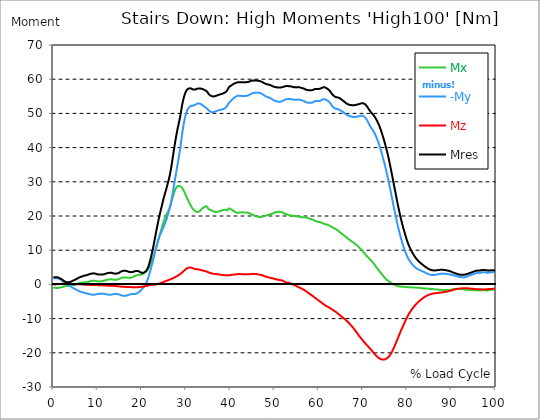
| Category |  Mx |  -My |  Mz |  Mres |
|---|---|---|---|---|
| 0.0 | -0.996 | 1.804 | -0.054 | 2.087 |
| 0.167348456675344 | -0.942 | 1.791 | -0.027 | 2.06 |
| 0.334696913350688 | -0.969 | 1.791 | -0.013 | 2.073 |
| 0.5020453700260321 | -1.037 | 1.804 | 0 | 2.114 |
| 0.669393826701376 | -1.064 | 1.791 | 0.027 | 2.114 |
| 0.83674228337672 | -1.064 | 1.777 | 0.054 | 2.087 |
| 1.0040907400520642 | -1.023 | 1.75 | 0.081 | 2.06 |
| 1.1621420602454444 | -0.983 | 1.683 | 0.108 | 1.979 |
| 1.3294905169207885 | -0.942 | 1.602 | 0.135 | 1.885 |
| 1.4968389735961325 | -0.916 | 1.508 | 0.162 | 1.791 |
| 1.6641874302714765 | -0.875 | 1.387 | 0.175 | 1.669 |
| 1.8315358869468206 | -0.835 | 1.266 | 0.188 | 1.535 |
| 1.9988843436221646 | -0.781 | 1.117 | 0.202 | 1.4 |
| 2.1662328002975086 | -0.714 | 0.956 | 0.202 | 1.239 |
| 2.333581256972853 | -0.633 | 0.754 | 0.188 | 1.05 |
| 2.5009297136481967 | -0.552 | 0.539 | 0.175 | 0.889 |
| 2.6682781703235405 | -0.525 | 0.35 | 0.175 | 0.794 |
| 2.8356266269988843 | -0.498 | 0.242 | 0.162 | 0.714 |
| 3.002975083674229 | -0.485 | 0.135 | 0.162 | 0.646 |
| 3.1703235403495724 | -0.471 | -0.013 | 0.148 | 0.619 |
| 3.337671997024917 | -0.471 | -0.162 | 0.148 | 0.619 |
| 3.4957233172182973 | -0.458 | -0.296 | 0.135 | 0.633 |
| 3.663071773893641 | -0.404 | -0.431 | 0.135 | 0.673 |
| 3.8304202305689854 | -0.364 | -0.565 | 0.121 | 0.74 |
| 3.997768687244329 | -0.337 | -0.687 | 0.108 | 0.808 |
| 4.165117143919673 | -0.296 | -0.821 | 0.108 | 0.902 |
| 4.332465600595017 | -0.256 | -0.956 | 0.094 | 1.023 |
| 4.499814057270361 | -0.215 | -1.091 | 0.067 | 1.131 |
| 4.667162513945706 | -0.188 | -1.198 | 0.054 | 1.239 |
| 4.834510970621049 | -0.135 | -1.306 | 0.04 | 1.333 |
| 5.001859427296393 | -0.04 | -1.4 | 0.04 | 1.427 |
| 5.169207883971737 | 0.054 | -1.521 | 0.04 | 1.548 |
| 5.336556340647081 | 0.135 | -1.656 | 0.027 | 1.669 |
| 5.503904797322425 | 0.215 | -1.764 | 0.027 | 1.791 |
| 5.671253253997769 | 0.283 | -1.871 | 0.027 | 1.912 |
| 5.82930457419115 | 0.35 | -1.966 | 0.013 | 2.006 |
| 5.996653030866494 | 0.417 | -2.06 | 0.013 | 2.114 |
| 6.164001487541838 | 0.458 | -2.127 | 0.013 | 2.195 |
| 6.331349944217181 | 0.471 | -2.208 | 0 | 2.262 |
| 6.498698400892526 | 0.498 | -2.275 | -0.013 | 2.343 |
| 6.66604685756787 | 0.539 | -2.343 | -0.04 | 2.41 |
| 6.833395314243213 | 0.579 | -2.41 | -0.054 | 2.477 |
| 7.000743770918558 | 0.646 | -2.464 | -0.067 | 2.558 |
| 7.168092227593902 | 0.646 | -2.518 | -0.067 | 2.598 |
| 7.335440684269246 | 0.606 | -2.558 | -0.081 | 2.639 |
| 7.50278914094459 | 0.592 | -2.612 | -0.081 | 2.679 |
| 7.6701375976199335 | 0.633 | -2.666 | -0.108 | 2.747 |
| 7.837486054295278 | 0.714 | -2.72 | -0.121 | 2.827 |
| 7.995537374488658 | 0.794 | -2.787 | -0.135 | 2.908 |
| 8.162885831164003 | 0.875 | -2.841 | -0.148 | 2.989 |
| 8.330234287839346 | 0.942 | -2.895 | -0.175 | 3.056 |
| 8.49758274451469 | 0.996 | -2.948 | -0.175 | 3.123 |
| 8.664931201190035 | 1.05 | -2.989 | -0.175 | 3.177 |
| 8.832279657865378 | 1.091 | -3.016 | -0.188 | 3.218 |
| 8.999628114540721 | 1.104 | -3.029 | -0.188 | 3.231 |
| 9.166976571216066 | 1.117 | -3.029 | -0.188 | 3.245 |
| 9.334325027891412 | 1.091 | -3.002 | -0.188 | 3.204 |
| 9.501673484566755 | 1.037 | -2.962 | -0.188 | 3.15 |
| 9.669021941242098 | 0.969 | -2.895 | -0.202 | 3.07 |
| 9.836370397917442 | 0.916 | -2.827 | -0.202 | 2.989 |
| 10.003718854592787 | 0.889 | -2.787 | -0.215 | 2.935 |
| 10.17106731126813 | 0.862 | -2.747 | -0.229 | 2.895 |
| 10.329118631461512 | 0.875 | -2.747 | -0.242 | 2.895 |
| 10.496467088136853 | 0.942 | -2.747 | -0.242 | 2.922 |
| 10.663815544812199 | 0.942 | -2.733 | -0.256 | 2.908 |
| 10.831164001487544 | 0.916 | -2.706 | -0.256 | 2.868 |
| 10.998512458162887 | 0.916 | -2.706 | -0.269 | 2.868 |
| 11.16586091483823 | 0.956 | -2.706 | -0.296 | 2.895 |
| 11.333209371513574 | 1.023 | -2.733 | -0.31 | 2.935 |
| 11.50055782818892 | 1.091 | -2.76 | -0.323 | 2.989 |
| 11.667906284864264 | 1.171 | -2.8 | -0.337 | 3.056 |
| 11.835254741539607 | 1.239 | -2.854 | -0.337 | 3.137 |
| 12.00260319821495 | 1.306 | -2.908 | -0.35 | 3.204 |
| 12.169951654890292 | 1.36 | -2.948 | -0.35 | 3.272 |
| 12.337300111565641 | 1.4 | -2.989 | -0.364 | 3.325 |
| 12.504648568240984 | 1.441 | -3.016 | -0.364 | 3.366 |
| 12.662699888434362 | 1.468 | -3.016 | -0.377 | 3.379 |
| 12.830048345109708 | 1.494 | -3.029 | -0.377 | 3.406 |
| 12.997396801785053 | 1.508 | -3.016 | -0.377 | 3.406 |
| 13.164745258460396 | 1.494 | -2.989 | -0.39 | 3.366 |
| 13.33209371513574 | 1.454 | -2.948 | -0.404 | 3.325 |
| 13.499442171811083 | 1.414 | -2.895 | -0.417 | 3.258 |
| 13.666790628486426 | 1.387 | -2.827 | -0.431 | 3.191 |
| 13.834139085161771 | 1.373 | -2.787 | -0.444 | 3.15 |
| 14.001487541837117 | 1.373 | -2.773 | -0.471 | 3.137 |
| 14.16883599851246 | 1.373 | -2.773 | -0.485 | 3.137 |
| 14.336184455187803 | 1.387 | -2.787 | -0.512 | 3.164 |
| 14.503532911863147 | 1.427 | -2.814 | -0.539 | 3.218 |
| 14.670881368538492 | 1.494 | -2.854 | -0.552 | 3.285 |
| 14.828932688731873 | 1.575 | -2.922 | -0.579 | 3.393 |
| 14.996281145407215 | 1.683 | -3.016 | -0.619 | 3.527 |
| 15.163629602082558 | 1.777 | -3.11 | -0.646 | 3.662 |
| 15.330978058757903 | 1.858 | -3.191 | -0.66 | 3.77 |
| 15.498326515433247 | 1.925 | -3.258 | -0.673 | 3.864 |
| 15.665674972108594 | 1.979 | -3.299 | -0.687 | 3.931 |
| 15.833023428783937 | 2.033 | -3.325 | -0.7 | 3.972 |
| 16.00037188545928 | 2.046 | -3.339 | -0.714 | 3.999 |
| 16.167720342134626 | 2.046 | -3.325 | -0.727 | 3.985 |
| 16.335068798809967 | 2.046 | -3.312 | -0.727 | 3.972 |
| 16.502417255485312 | 2.019 | -3.285 | -0.74 | 3.931 |
| 16.669765712160658 | 1.979 | -3.231 | -0.754 | 3.877 |
| 16.837114168836 | 1.939 | -3.15 | -0.754 | 3.797 |
| 17.004462625511344 | 1.912 | -3.056 | -0.767 | 3.702 |
| 17.16251394570472 | 1.898 | -2.989 | -0.781 | 3.649 |
| 17.32986240238007 | 1.912 | -2.922 | -0.781 | 3.608 |
| 17.497210859055414 | 1.939 | -2.868 | -0.794 | 3.581 |
| 17.664559315730756 | 1.979 | -2.827 | -0.808 | 3.568 |
| 17.8319077724061 | 2.06 | -2.814 | -0.808 | 3.608 |
| 17.999256229081443 | 2.141 | -2.8 | -0.821 | 3.635 |
| 18.166604685756788 | 2.248 | -2.814 | -0.821 | 3.716 |
| 18.333953142432133 | 2.383 | -2.814 | -0.835 | 3.81 |
| 18.501301599107478 | 2.491 | -2.814 | -0.835 | 3.891 |
| 18.668650055782823 | 2.585 | -2.76 | -0.835 | 3.931 |
| 18.835998512458165 | 2.679 | -2.666 | -0.821 | 3.931 |
| 19.00334696913351 | 2.747 | -2.518 | -0.808 | 3.931 |
| 19.170695425808855 | 2.8 | -2.41 | -0.794 | 3.904 |
| 19.338043882484197 | 2.8 | -2.275 | -0.781 | 3.824 |
| 19.496095202677576 | 2.8 | -2.114 | -0.781 | 3.716 |
| 19.66344365935292 | 2.8 | -1.898 | -0.767 | 3.568 |
| 19.830792116028263 | 2.8 | -1.656 | -0.74 | 3.433 |
| 19.998140572703612 | 2.895 | -1.387 | -0.687 | 3.366 |
| 20.165489029378953 | 2.989 | -1.185 | -0.673 | 3.366 |
| 20.3328374860543 | 3.123 | -0.969 | -0.646 | 3.393 |
| 20.500185942729644 | 3.285 | -0.7 | -0.606 | 3.46 |
| 20.667534399404985 | 3.46 | -0.323 | -0.552 | 3.581 |
| 20.83488285608033 | 3.635 | 0 | -0.512 | 3.743 |
| 21.002231312755672 | 3.851 | 0.404 | -0.471 | 3.985 |
| 21.16957976943102 | 4.079 | 0.902 | -0.417 | 4.322 |
| 21.336928226106362 | 4.362 | 1.481 | -0.364 | 4.753 |
| 21.504276682781704 | 4.685 | 2.114 | -0.31 | 5.264 |
| 21.67162513945705 | 5.089 | 2.868 | -0.269 | 5.978 |
| 21.82967645965043 | 5.56 | 3.608 | -0.229 | 6.745 |
| 21.997024916325774 | 6.058 | 4.376 | -0.188 | 7.58 |
| 22.16437337300112 | 6.57 | 5.17 | -0.162 | 8.468 |
| 22.33172182967646 | 7.109 | 5.978 | -0.135 | 9.397 |
| 22.499070286351806 | 7.701 | 6.826 | -0.108 | 10.407 |
| 22.666418743027148 | 8.347 | 7.701 | -0.094 | 11.471 |
| 22.833767199702496 | 9.034 | 8.617 | -0.067 | 12.602 |
| 23.00111565637784 | 9.734 | 9.532 | -0.04 | 13.746 |
| 23.168464113053183 | 10.461 | 10.421 | -0.013 | 14.877 |
| 23.335812569728528 | 11.201 | 11.255 | 0.013 | 16.008 |
| 23.50316102640387 | 11.982 | 12.023 | 0.054 | 17.098 |
| 23.670509483079215 | 12.723 | 12.75 | 0.121 | 18.149 |
| 23.83785793975456 | 13.517 | 13.423 | 0.202 | 19.185 |
| 23.995909259947936 | 14.285 | 14.069 | 0.283 | 20.182 |
| 24.163257716623285 | 15.025 | 14.581 | 0.35 | 21.084 |
| 24.330606173298627 | 15.739 | 15.065 | 0.431 | 21.959 |
| 24.49795462997397 | 16.479 | 15.577 | 0.525 | 22.861 |
| 24.665303086649313 | 17.206 | 16.075 | 0.592 | 23.749 |
| 24.83265154332466 | 17.933 | 16.587 | 0.687 | 24.638 |
| 25.0 | 18.579 | 17.112 | 0.754 | 25.473 |
| 25.167348456675345 | 19.199 | 17.61 | 0.848 | 26.253 |
| 25.334696913350694 | 19.697 | 18.162 | 0.929 | 26.994 |
| 25.502045370026035 | 20.195 | 18.754 | 0.996 | 27.748 |
| 25.669393826701377 | 20.666 | 19.428 | 1.077 | 28.556 |
| 25.836742283376722 | 21.11 | 20.155 | 1.171 | 29.363 |
| 26.004090740052067 | 21.541 | 20.922 | 1.252 | 30.198 |
| 26.17143919672741 | 21.945 | 21.716 | 1.333 | 31.046 |
| 26.329490516920792 | 22.497 | 22.524 | 1.414 | 31.989 |
| 26.49683897359613 | 23.143 | 23.399 | 1.508 | 33.079 |
| 26.66418743027148 | 23.938 | 24.436 | 1.589 | 34.358 |
| 26.831535886946828 | 24.746 | 25.553 | 1.683 | 35.705 |
| 26.998884343622166 | 25.553 | 26.859 | 1.777 | 37.172 |
| 27.166232800297514 | 26.294 | 28.098 | 1.871 | 38.572 |
| 27.333581256972852 | 26.927 | 29.39 | 1.979 | 39.946 |
| 27.5009297136482 | 27.519 | 30.683 | 2.087 | 41.292 |
| 27.668278170323543 | 28.004 | 31.962 | 2.208 | 42.571 |
| 27.835626626998888 | 28.34 | 33.214 | 2.329 | 43.756 |
| 28.002975083674233 | 28.636 | 34.466 | 2.464 | 44.9 |
| 28.170323540349575 | 28.811 | 35.705 | 2.612 | 45.977 |
| 28.33767199702492 | 28.811 | 36.957 | 2.733 | 46.974 |
| 28.50502045370026 | 28.785 | 38.222 | 2.854 | 47.97 |
| 28.663071773893645 | 28.717 | 39.596 | 3.002 | 49.047 |
| 28.830420230568986 | 28.583 | 41.184 | 3.164 | 50.272 |
| 28.99776868724433 | 28.394 | 42.881 | 3.352 | 51.565 |
| 29.165117143919673 | 28.152 | 44.483 | 3.554 | 52.79 |
| 29.33246560059502 | 27.775 | 45.856 | 3.756 | 53.772 |
| 29.499814057270367 | 27.357 | 47.122 | 3.958 | 54.648 |
| 29.66716251394571 | 26.913 | 48.226 | 4.133 | 55.402 |
| 29.834510970621054 | 26.402 | 49.181 | 4.349 | 56.007 |
| 30.00185942729639 | 25.917 | 49.922 | 4.51 | 56.452 |
| 30.169207883971744 | 25.405 | 50.595 | 4.645 | 56.829 |
| 30.33655634064708 | 24.948 | 51.093 | 4.779 | 57.084 |
| 30.50390479732243 | 24.49 | 51.47 | 4.86 | 57.233 |
| 30.671253253997772 | 24.059 | 51.74 | 4.914 | 57.313 |
| 30.829304574191156 | 23.628 | 51.968 | 4.955 | 57.34 |
| 30.996653030866494 | 23.224 | 52.13 | 4.955 | 57.327 |
| 31.164001487541842 | 22.82 | 52.238 | 4.914 | 57.273 |
| 31.331349944217187 | 22.43 | 52.265 | 4.833 | 57.138 |
| 31.498698400892525 | 22.12 | 52.251 | 4.726 | 57.017 |
| 31.666046857567874 | 21.837 | 52.292 | 4.658 | 56.95 |
| 31.833395314243212 | 21.662 | 52.386 | 4.591 | 56.963 |
| 32.00074377091856 | 21.528 | 52.467 | 4.524 | 56.99 |
| 32.1680922275939 | 21.326 | 52.588 | 4.47 | 57.017 |
| 32.33544068426925 | 21.232 | 52.736 | 4.456 | 57.125 |
| 32.50278914094459 | 21.191 | 52.844 | 4.429 | 57.206 |
| 32.670137597619934 | 21.178 | 52.911 | 4.403 | 57.259 |
| 32.83748605429528 | 21.245 | 52.911 | 4.362 | 57.286 |
| 33.004834510970625 | 21.312 | 52.924 | 4.322 | 57.313 |
| 33.162885831164004 | 21.501 | 52.844 | 4.254 | 57.286 |
| 33.33023428783935 | 21.77 | 52.736 | 4.201 | 57.273 |
| 33.497582744514695 | 21.999 | 52.601 | 4.133 | 57.219 |
| 33.664931201190036 | 22.214 | 52.44 | 4.079 | 57.152 |
| 33.83227965786538 | 22.376 | 52.292 | 4.026 | 57.058 |
| 33.99962811454073 | 22.443 | 52.143 | 3.999 | 56.95 |
| 34.16697657121607 | 22.591 | 51.982 | 3.931 | 56.856 |
| 34.33432502789141 | 22.74 | 51.807 | 3.877 | 56.761 |
| 34.50167348456676 | 22.888 | 51.632 | 3.81 | 56.654 |
| 34.6690219412421 | 22.888 | 51.443 | 3.756 | 56.479 |
| 34.83637039791744 | 22.578 | 51.322 | 3.675 | 56.25 |
| 35.00371885459279 | 22.134 | 51.093 | 3.554 | 55.886 |
| 35.17106731126814 | 21.945 | 50.837 | 3.46 | 55.59 |
| 35.338415767943474 | 21.811 | 50.622 | 3.379 | 55.348 |
| 35.49646708813686 | 21.77 | 50.501 | 3.312 | 55.227 |
| 35.6638155448122 | 21.689 | 50.42 | 3.258 | 55.119 |
| 35.831164001487544 | 21.568 | 50.38 | 3.218 | 55.038 |
| 35.998512458162885 | 21.474 | 50.326 | 3.164 | 54.957 |
| 36.165860914838234 | 21.42 | 50.339 | 3.11 | 54.944 |
| 36.333209371513576 | 21.326 | 50.407 | 3.07 | 54.971 |
| 36.50055782818892 | 21.191 | 50.501 | 3.056 | 55.025 |
| 36.667906284864266 | 21.084 | 50.609 | 3.043 | 55.078 |
| 36.83525474153961 | 21.097 | 50.689 | 3.029 | 55.159 |
| 37.002603198214956 | 21.164 | 50.757 | 2.989 | 55.253 |
| 37.1699516548903 | 21.218 | 50.824 | 2.962 | 55.321 |
| 37.337300111565646 | 21.312 | 50.878 | 2.935 | 55.402 |
| 37.50464856824098 | 21.353 | 50.959 | 2.895 | 55.482 |
| 37.66269988843437 | 21.407 | 50.999 | 2.854 | 55.536 |
| 37.83004834510971 | 21.474 | 51.053 | 2.827 | 55.59 |
| 37.99739680178505 | 21.555 | 51.107 | 2.787 | 55.657 |
| 38.16474525846039 | 21.636 | 51.161 | 2.747 | 55.738 |
| 38.33209371513574 | 21.73 | 51.214 | 2.72 | 55.819 |
| 38.49944217181109 | 21.824 | 51.295 | 2.706 | 55.913 |
| 38.666790628486424 | 21.837 | 51.416 | 2.693 | 56.021 |
| 38.83413908516178 | 21.824 | 51.551 | 2.679 | 56.129 |
| 39.001487541837115 | 21.837 | 51.74 | 2.679 | 56.304 |
| 39.16883599851246 | 21.784 | 51.995 | 2.666 | 56.506 |
| 39.336184455187805 | 21.649 | 52.278 | 2.625 | 56.707 |
| 39.503532911863154 | 21.837 | 52.709 | 2.612 | 57.165 |
| 39.670881368538495 | 22.201 | 53.072 | 2.652 | 57.636 |
| 39.83822982521384 | 22.241 | 53.288 | 2.693 | 57.838 |
| 39.996281145407224 | 22.134 | 53.476 | 2.733 | 57.973 |
| 40.163629602082565 | 21.959 | 53.692 | 2.76 | 58.108 |
| 40.33097805875791 | 21.784 | 53.921 | 2.787 | 58.256 |
| 40.498326515433256 | 21.676 | 54.163 | 2.8 | 58.431 |
| 40.6656749721086 | 21.568 | 54.351 | 2.841 | 58.579 |
| 40.83302342878393 | 21.407 | 54.526 | 2.881 | 58.687 |
| 41.00037188545929 | 21.286 | 54.661 | 2.922 | 58.767 |
| 41.16772034213463 | 21.164 | 54.809 | 2.922 | 58.862 |
| 41.33506879880997 | 21.057 | 54.957 | 2.935 | 58.956 |
| 41.50241725548531 | 20.962 | 55.078 | 2.962 | 59.037 |
| 41.66976571216066 | 20.922 | 55.146 | 2.989 | 59.09 |
| 41.837114168836 | 21.003 | 55.146 | 3.029 | 59.117 |
| 42.004462625511344 | 20.989 | 55.173 | 3.029 | 59.144 |
| 42.17181108218669 | 20.976 | 55.186 | 3.043 | 59.144 |
| 42.32986240238007 | 21.043 | 55.132 | 3.016 | 59.131 |
| 42.497210859055414 | 21.097 | 55.092 | 2.989 | 59.104 |
| 42.66455931573076 | 21.084 | 55.078 | 2.975 | 59.09 |
| 42.831907772406105 | 21.057 | 55.078 | 2.948 | 59.077 |
| 42.999256229081446 | 21.043 | 55.105 | 2.948 | 59.09 |
| 43.16660468575679 | 21.043 | 55.078 | 2.935 | 59.077 |
| 43.33395314243214 | 21.057 | 55.065 | 2.962 | 59.064 |
| 43.50130159910748 | 21.043 | 55.092 | 2.935 | 59.077 |
| 43.66865005578282 | 21.043 | 55.132 | 2.948 | 59.131 |
| 43.83599851245817 | 21.003 | 55.173 | 2.962 | 59.144 |
| 44.00334696913351 | 20.949 | 55.24 | 2.962 | 59.185 |
| 44.17069542580886 | 20.882 | 55.321 | 2.948 | 59.239 |
| 44.3380438824842 | 20.801 | 55.428 | 2.962 | 59.319 |
| 44.49609520267758 | 20.707 | 55.577 | 3.016 | 59.414 |
| 44.66344365935292 | 20.572 | 55.698 | 3.043 | 59.494 |
| 44.83079211602827 | 20.478 | 55.805 | 3.029 | 59.548 |
| 44.99814057270361 | 20.37 | 55.886 | 3.043 | 59.602 |
| 45.16548902937895 | 20.262 | 55.954 | 3.07 | 59.629 |
| 45.332837486054295 | 20.155 | 56.007 | 3.083 | 59.642 |
| 45.500185942729644 | 20.074 | 56.034 | 3.07 | 59.629 |
| 45.66753439940499 | 19.993 | 56.048 | 3.056 | 59.616 |
| 45.83488285608033 | 19.926 | 56.061 | 3.056 | 59.602 |
| 46.00223131275568 | 19.845 | 56.075 | 3.002 | 59.589 |
| 46.16957976943102 | 19.791 | 56.075 | 2.962 | 59.575 |
| 46.336928226106366 | 19.751 | 56.075 | 2.908 | 59.562 |
| 46.50427668278171 | 19.737 | 56.034 | 2.881 | 59.508 |
| 46.671625139457056 | 19.71 | 55.98 | 2.841 | 59.454 |
| 46.829676459650436 | 19.71 | 55.913 | 2.8 | 59.387 |
| 46.99702491632577 | 19.737 | 55.819 | 2.76 | 59.306 |
| 47.16437337300112 | 19.791 | 55.698 | 2.693 | 59.212 |
| 47.33172182967646 | 19.858 | 55.563 | 2.625 | 59.104 |
| 47.49907028635181 | 19.899 | 55.415 | 2.545 | 58.969 |
| 47.66641874302716 | 19.953 | 55.253 | 2.437 | 58.835 |
| 47.83376719970249 | 20.033 | 55.119 | 2.37 | 58.727 |
| 48.001115656377834 | 20.114 | 55.011 | 2.289 | 58.66 |
| 48.16846411305319 | 20.195 | 54.917 | 2.221 | 58.592 |
| 48.33581256972853 | 20.262 | 54.809 | 2.154 | 58.512 |
| 48.50316102640387 | 20.316 | 54.742 | 2.1 | 58.458 |
| 48.67050948307921 | 20.37 | 54.675 | 2.046 | 58.417 |
| 48.837857939754564 | 20.451 | 54.607 | 2.006 | 58.377 |
| 49.005206396429905 | 20.518 | 54.5 | 1.952 | 58.31 |
| 49.163257716623285 | 20.545 | 54.392 | 1.898 | 58.215 |
| 49.33060617329863 | 20.612 | 54.244 | 1.844 | 58.094 |
| 49.49795462997397 | 20.693 | 54.096 | 1.791 | 57.987 |
| 49.66530308664932 | 20.774 | 53.948 | 1.75 | 57.879 |
| 49.832651543324666 | 20.868 | 53.84 | 1.683 | 57.825 |
| 50.0 | 20.989 | 53.746 | 1.616 | 57.758 |
| 50.16734845667534 | 21.097 | 53.638 | 1.562 | 57.704 |
| 50.33469691335069 | 21.124 | 53.584 | 1.508 | 57.663 |
| 50.50204537002604 | 21.151 | 53.517 | 1.454 | 57.623 |
| 50.66939382670139 | 21.178 | 53.476 | 1.414 | 57.596 |
| 50.836742283376715 | 21.218 | 53.436 | 1.36 | 57.569 |
| 51.00409074005207 | 21.259 | 53.409 | 1.319 | 57.556 |
| 51.17143919672741 | 21.286 | 53.396 | 1.279 | 57.556 |
| 51.32949051692079 | 21.272 | 53.422 | 1.239 | 57.583 |
| 51.496838973596134 | 21.232 | 53.463 | 1.212 | 57.596 |
| 51.66418743027148 | 21.164 | 53.53 | 1.185 | 57.623 |
| 51.831535886946824 | 21.07 | 53.638 | 1.131 | 57.69 |
| 51.99888434362217 | 20.909 | 53.786 | 1.01 | 57.771 |
| 52.16623280029752 | 20.801 | 53.907 | 0.889 | 57.838 |
| 52.33358125697285 | 20.693 | 54.015 | 0.74 | 57.919 |
| 52.5009297136482 | 20.599 | 54.109 | 0.619 | 57.96 |
| 52.668278170323546 | 20.532 | 54.149 | 0.579 | 57.987 |
| 52.835626626998895 | 20.464 | 54.19 | 0.552 | 58 |
| 53.00297508367424 | 20.41 | 54.19 | 0.498 | 57.987 |
| 53.17032354034958 | 20.343 | 54.203 | 0.444 | 57.96 |
| 53.33767199702492 | 20.262 | 54.203 | 0.404 | 57.933 |
| 53.50502045370027 | 20.195 | 54.217 | 0.337 | 57.933 |
| 53.663071773893655 | 20.114 | 54.244 | 0.256 | 57.919 |
| 53.83042023056899 | 20.06 | 54.19 | 0.188 | 57.852 |
| 53.99776868724433 | 20.047 | 54.123 | 0.108 | 57.798 |
| 54.16511714391967 | 20.033 | 54.055 | 0.013 | 57.731 |
| 54.33246560059503 | 20.047 | 53.988 | -0.094 | 57.677 |
| 54.49981405727037 | 20.006 | 53.988 | -0.188 | 57.663 |
| 54.667162513945705 | 19.966 | 53.988 | -0.283 | 57.663 |
| 54.834510970621054 | 19.912 | 53.988 | -0.404 | 57.636 |
| 55.0018594272964 | 19.899 | 53.961 | -0.512 | 57.61 |
| 55.169207883971744 | 19.858 | 54.042 | -0.619 | 57.677 |
| 55.336556340647086 | 19.831 | 54.055 | -0.74 | 57.69 |
| 55.50390479732243 | 19.791 | 54.028 | -0.848 | 57.663 |
| 55.671253253997776 | 19.751 | 54.015 | -0.942 | 57.636 |
| 55.83860171067312 | 19.724 | 53.974 | -1.023 | 57.583 |
| 55.9966530308665 | 19.683 | 53.867 | -1.117 | 57.488 |
| 56.16400148754184 | 19.63 | 53.799 | -1.225 | 57.408 |
| 56.33134994421718 | 19.603 | 53.772 | -1.36 | 57.381 |
| 56.498698400892536 | 19.616 | 53.705 | -1.481 | 57.327 |
| 56.66604685756788 | 19.643 | 53.597 | -1.602 | 57.246 |
| 56.83339531424321 | 19.63 | 53.476 | -1.737 | 57.138 |
| 57.00074377091856 | 19.589 | 53.355 | -1.885 | 57.017 |
| 57.16809222759391 | 19.549 | 53.261 | -2.006 | 56.923 |
| 57.33544068426925 | 19.495 | 53.194 | -2.168 | 56.856 |
| 57.5027891409446 | 19.387 | 53.153 | -2.356 | 56.815 |
| 57.670137597619934 | 19.347 | 53.126 | -2.504 | 56.788 |
| 57.83748605429528 | 19.293 | 53.14 | -2.652 | 56.788 |
| 58.004834510970625 | 19.226 | 53.126 | -2.814 | 56.775 |
| 58.16288583116401 | 19.145 | 53.126 | -2.962 | 56.761 |
| 58.330234287839346 | 19.064 | 53.126 | -3.11 | 56.748 |
| 58.497582744514695 | 18.983 | 53.153 | -3.258 | 56.761 |
| 58.66493120119004 | 18.916 | 53.247 | -3.42 | 56.842 |
| 58.832279657865385 | 18.849 | 53.355 | -3.595 | 56.936 |
| 58.999628114540734 | 18.727 | 53.503 | -3.77 | 57.071 |
| 59.16697657121607 | 18.606 | 53.571 | -3.931 | 57.125 |
| 59.33432502789142 | 18.512 | 53.597 | -4.093 | 57.138 |
| 59.50167348456676 | 18.431 | 53.624 | -4.241 | 57.152 |
| 59.66902194124211 | 18.351 | 53.624 | -4.403 | 57.152 |
| 59.83637039791745 | 18.31 | 53.611 | -4.564 | 57.152 |
| 60.00371885459278 | 18.27 | 53.597 | -4.726 | 57.152 |
| 60.17106731126813 | 18.243 | 53.624 | -4.874 | 57.192 |
| 60.33841576794349 | 18.202 | 53.665 | -5.035 | 57.233 |
| 60.49646708813685 | 18.122 | 53.786 | -5.197 | 57.327 |
| 60.6638155448122 | 18.027 | 53.921 | -5.358 | 57.435 |
| 60.831164001487544 | 17.92 | 54.042 | -5.52 | 57.529 |
| 60.99851245816289 | 17.812 | 54.149 | -5.695 | 57.61 |
| 61.16586091483824 | 17.731 | 54.19 | -5.857 | 57.65 |
| 61.333209371513576 | 17.677 | 54.163 | -6.018 | 57.623 |
| 61.50055782818892 | 17.623 | 54.096 | -6.166 | 57.556 |
| 61.667906284864266 | 17.543 | 53.988 | -6.301 | 57.448 |
| 61.835254741539615 | 17.448 | 53.853 | -6.422 | 57.3 |
| 62.002603198214956 | 17.395 | 53.719 | -6.516 | 57.152 |
| 62.16995165489029 | 17.341 | 53.571 | -6.61 | 57.004 |
| 62.33730011156564 | 17.247 | 53.396 | -6.745 | 56.829 |
| 62.504648568240995 | 17.125 | 53.18 | -6.893 | 56.613 |
| 62.67199702491633 | 17.004 | 52.884 | -7.028 | 56.317 |
| 62.83004834510971 | 16.87 | 52.561 | -7.176 | 55.994 |
| 62.99739680178505 | 16.735 | 52.211 | -7.297 | 55.657 |
| 63.1647452584604 | 16.614 | 51.941 | -7.445 | 55.388 |
| 63.33209371513575 | 16.493 | 51.753 | -7.593 | 55.2 |
| 63.4994421718111 | 16.385 | 51.591 | -7.714 | 55.025 |
| 63.666790628486424 | 16.291 | 51.443 | -7.863 | 54.89 |
| 63.83413908516177 | 16.196 | 51.349 | -8.024 | 54.782 |
| 64.00148754183712 | 16.062 | 51.282 | -8.159 | 54.701 |
| 64.16883599851248 | 15.927 | 51.268 | -8.347 | 54.688 |
| 64.3361844551878 | 15.766 | 51.241 | -8.536 | 54.675 |
| 64.50353291186315 | 15.537 | 51.161 | -8.738 | 54.594 |
| 64.6708813685385 | 15.362 | 51.066 | -8.899 | 54.486 |
| 64.83822982521384 | 15.2 | 50.959 | -9.061 | 54.365 |
| 65.00557828188919 | 15.039 | 50.811 | -9.236 | 54.203 |
| 65.16362960208257 | 14.89 | 50.662 | -9.37 | 54.028 |
| 65.3309780587579 | 14.729 | 50.528 | -9.532 | 53.867 |
| 65.49832651543326 | 14.527 | 50.38 | -9.721 | 53.719 |
| 65.6656749721086 | 14.365 | 50.245 | -9.909 | 53.557 |
| 65.83302342878395 | 14.19 | 50.084 | -10.084 | 53.382 |
| 66.00037188545929 | 14.029 | 49.895 | -10.259 | 53.167 |
| 66.16772034213463 | 13.867 | 49.72 | -10.461 | 52.992 |
| 66.33506879880998 | 13.679 | 49.585 | -10.663 | 52.844 |
| 66.50241725548531 | 13.49 | 49.451 | -10.878 | 52.722 |
| 66.66976571216065 | 13.329 | 49.343 | -11.094 | 52.628 |
| 66.83711416883601 | 13.181 | 49.249 | -11.309 | 52.534 |
| 67.00446262551135 | 13.032 | 49.181 | -11.538 | 52.48 |
| 67.1718110821867 | 12.871 | 49.155 | -11.767 | 52.467 |
| 67.32986240238007 | 12.669 | 49.114 | -12.023 | 52.453 |
| 67.49721085905541 | 12.534 | 49.06 | -12.265 | 52.399 |
| 67.66455931573076 | 12.413 | 48.993 | -12.494 | 52.345 |
| 67.83190777240611 | 12.346 | 48.993 | -12.763 | 52.386 |
| 67.99925622908145 | 12.144 | 48.98 | -13.046 | 52.399 |
| 68.16660468575678 | 11.848 | 48.953 | -13.329 | 52.399 |
| 68.33395314243214 | 11.686 | 48.953 | -13.611 | 52.44 |
| 68.50130159910749 | 11.592 | 48.966 | -13.894 | 52.493 |
| 68.66865005578282 | 11.43 | 49.033 | -14.204 | 52.574 |
| 68.83599851245816 | 11.228 | 49.074 | -14.513 | 52.628 |
| 69.00334696913352 | 11 | 49.114 | -14.81 | 52.682 |
| 69.17069542580886 | 10.784 | 49.181 | -15.092 | 52.763 |
| 69.3380438824842 | 10.555 | 49.222 | -15.375 | 52.817 |
| 69.50539233915956 | 10.313 | 49.249 | -15.644 | 52.884 |
| 69.66344365935292 | 10.071 | 49.303 | -15.9 | 52.951 |
| 69.83079211602826 | 9.842 | 49.357 | -16.169 | 53.032 |
| 69.99814057270362 | 9.599 | 49.276 | -16.439 | 52.992 |
| 70.16548902937896 | 9.357 | 49.155 | -16.695 | 52.911 |
| 70.33283748605429 | 9.128 | 48.993 | -16.95 | 52.803 |
| 70.50018594272964 | 8.886 | 48.778 | -17.193 | 52.642 |
| 70.667534399405 | 8.63 | 48.522 | -17.435 | 52.44 |
| 70.83488285608033 | 8.361 | 48.212 | -17.677 | 52.184 |
| 71.00223131275568 | 8.118 | 47.862 | -17.906 | 51.888 |
| 71.16957976943102 | 7.903 | 47.431 | -18.122 | 51.551 |
| 71.33692822610637 | 7.674 | 47.014 | -18.364 | 51.214 |
| 71.50427668278171 | 7.445 | 46.597 | -18.606 | 50.891 |
| 71.67162513945706 | 7.216 | 46.166 | -18.862 | 50.568 |
| 71.8389735961324 | 6.987 | 45.802 | -19.118 | 50.285 |
| 71.99702491632577 | 6.759 | 45.506 | -19.387 | 50.057 |
| 72.16437337300113 | 6.516 | 45.21 | -19.656 | 49.841 |
| 72.33172182967647 | 6.287 | 44.873 | -19.912 | 49.585 |
| 72.49907028635181 | 5.991 | 44.469 | -20.168 | 49.289 |
| 72.66641874302715 | 5.682 | 44.079 | -20.41 | 48.98 |
| 72.8337671997025 | 5.372 | 43.635 | -20.639 | 48.643 |
| 73.00111565637783 | 5.076 | 43.163 | -20.868 | 48.266 |
| 73.16846411305319 | 4.779 | 42.611 | -21.097 | 47.849 |
| 73.33581256972853 | 4.51 | 42.059 | -21.299 | 47.418 |
| 73.50316102640387 | 4.227 | 41.467 | -21.447 | 46.947 |
| 73.67050948307921 | 3.958 | 40.834 | -21.595 | 46.435 |
| 73.83785793975457 | 3.689 | 40.161 | -21.73 | 45.883 |
| 74.00520639642991 | 3.406 | 39.474 | -21.824 | 45.304 |
| 74.16325771662328 | 3.137 | 38.747 | -21.918 | 44.685 |
| 74.33060617329863 | 2.854 | 37.953 | -21.959 | 43.998 |
| 74.49795462997398 | 2.585 | 37.145 | -21.986 | 43.298 |
| 74.66530308664932 | 2.329 | 36.337 | -21.999 | 42.598 |
| 74.83265154332466 | 2.087 | 35.503 | -21.959 | 41.844 |
| 75.00000000000001 | 1.858 | 34.641 | -21.905 | 41.077 |
| 75.16734845667534 | 1.643 | 33.753 | -21.811 | 40.269 |
| 75.3346969133507 | 1.441 | 32.837 | -21.689 | 39.434 |
| 75.50204537002605 | 1.252 | 31.922 | -21.541 | 38.572 |
| 75.66939382670138 | 1.077 | 30.979 | -21.38 | 37.697 |
| 75.83674228337672 | 0.916 | 29.956 | -21.151 | 36.728 |
| 76.00409074005208 | 0.767 | 28.919 | -20.855 | 35.705 |
| 76.17143919672742 | 0.619 | 27.869 | -20.545 | 34.668 |
| 76.33878765340276 | 0.471 | 26.792 | -20.208 | 33.604 |
| 76.49683897359614 | 0.323 | 25.715 | -19.845 | 32.514 |
| 76.66418743027148 | 0.188 | 24.638 | -19.428 | 31.41 |
| 76.83153588694682 | 0.067 | 23.547 | -18.97 | 30.279 |
| 76.99888434362218 | -0.027 | 22.484 | -18.499 | 29.148 |
| 77.16623280029752 | -0.121 | 21.447 | -18 | 28.044 |
| 77.33358125697285 | -0.215 | 20.464 | -17.516 | 26.98 |
| 77.5009297136482 | -0.296 | 19.441 | -16.991 | 25.863 |
| 77.66827817032356 | -0.377 | 18.377 | -16.439 | 24.705 |
| 77.83562662699889 | -0.458 | 17.408 | -15.9 | 23.628 |
| 78.00297508367423 | -0.539 | 16.493 | -15.389 | 22.605 |
| 78.17032354034959 | -0.592 | 15.604 | -14.864 | 21.595 |
| 78.33767199702493 | -0.633 | 14.742 | -14.338 | 20.612 |
| 78.50502045370027 | -0.646 | 13.921 | -13.813 | 19.67 |
| 78.67236891037561 | -0.66 | 13.14 | -13.315 | 18.768 |
| 78.83042023056899 | -0.66 | 12.413 | -12.831 | 17.92 |
| 78.99776868724433 | -0.673 | 11.713 | -12.346 | 17.085 |
| 79.16511714391969 | -0.687 | 11.067 | -11.875 | 16.291 |
| 79.33246560059503 | -0.7 | 10.461 | -11.403 | 15.55 |
| 79.49981405727036 | -0.727 | 9.842 | -10.932 | 14.796 |
| 79.66716251394571 | -0.754 | 9.263 | -10.461 | 14.056 |
| 79.83451097062107 | -0.781 | 8.711 | -10.003 | 13.356 |
| 80.00185942729641 | -0.808 | 8.213 | -9.559 | 12.696 |
| 80.16920788397174 | -0.835 | 7.755 | -9.142 | 12.09 |
| 80.33655634064709 | -0.848 | 7.351 | -8.765 | 11.538 |
| 80.50390479732243 | -0.848 | 7.001 | -8.401 | 11.04 |
| 80.67125325399778 | -0.848 | 6.691 | -8.065 | 10.582 |
| 80.83860171067312 | -0.835 | 6.395 | -7.768 | 10.165 |
| 80.99665303086651 | -0.848 | 6.099 | -7.432 | 9.721 |
| 81.16400148754184 | -0.875 | 5.816 | -7.122 | 9.29 |
| 81.3313499442172 | -0.889 | 5.574 | -6.826 | 8.913 |
| 81.49869840089255 | -0.902 | 5.345 | -6.557 | 8.563 |
| 81.66604685756786 | -0.916 | 5.156 | -6.287 | 8.24 |
| 81.83339531424322 | -0.929 | 4.968 | -6.032 | 7.916 |
| 82.00074377091858 | -0.956 | 4.793 | -5.789 | 7.62 |
| 82.16809222759392 | -0.969 | 4.631 | -5.56 | 7.351 |
| 82.33544068426926 | -0.969 | 4.483 | -5.358 | 7.095 |
| 82.50278914094459 | -0.969 | 4.362 | -5.156 | 6.866 |
| 82.67013759761994 | -0.969 | 4.268 | -4.968 | 6.664 |
| 82.83748605429528 | -0.996 | 4.174 | -4.779 | 6.462 |
| 83.00483451097062 | -1.05 | 4.079 | -4.591 | 6.287 |
| 83.17218296764597 | -1.091 | 3.985 | -4.416 | 6.099 |
| 83.33023428783935 | -1.117 | 3.904 | -4.241 | 5.924 |
| 83.4975827445147 | -1.144 | 3.81 | -4.066 | 5.749 |
| 83.66493120119004 | -1.171 | 3.716 | -3.918 | 5.574 |
| 83.83227965786537 | -1.185 | 3.608 | -3.77 | 5.399 |
| 83.99962811454073 | -1.185 | 3.487 | -3.622 | 5.224 |
| 84.16697657121607 | -1.198 | 3.393 | -3.5 | 5.076 |
| 84.33432502789142 | -1.212 | 3.285 | -3.379 | 4.928 |
| 84.50167348456677 | -1.225 | 3.191 | -3.272 | 4.793 |
| 84.6690219412421 | -1.239 | 3.083 | -3.164 | 4.658 |
| 84.83637039791745 | -1.252 | 3.002 | -3.07 | 4.524 |
| 85.0037188545928 | -1.279 | 2.922 | -2.975 | 4.416 |
| 85.17106731126813 | -1.306 | 2.868 | -2.908 | 4.335 |
| 85.33841576794349 | -1.319 | 2.814 | -2.841 | 4.254 |
| 85.50576422461883 | -1.346 | 2.773 | -2.787 | 4.187 |
| 85.66381554481221 | -1.36 | 2.747 | -2.733 | 4.133 |
| 85.83116400148755 | -1.387 | 2.733 | -2.693 | 4.106 |
| 85.99851245816289 | -1.414 | 2.747 | -2.652 | 4.093 |
| 86.16586091483823 | -1.427 | 2.773 | -2.612 | 4.093 |
| 86.33320937151358 | -1.454 | 2.787 | -2.571 | 4.079 |
| 86.50055782818893 | -1.468 | 2.827 | -2.545 | 4.106 |
| 86.66790628486427 | -1.481 | 2.881 | -2.518 | 4.133 |
| 86.83525474153961 | -1.508 | 2.935 | -2.491 | 4.16 |
| 87.00260319821496 | -1.535 | 2.989 | -2.464 | 4.187 |
| 87.16995165489031 | -1.548 | 3.029 | -2.437 | 4.214 |
| 87.33730011156564 | -1.562 | 3.083 | -2.41 | 4.241 |
| 87.504648568241 | -1.589 | 3.11 | -2.383 | 4.254 |
| 87.67199702491634 | -1.616 | 3.137 | -2.37 | 4.268 |
| 87.83004834510972 | -1.629 | 3.15 | -2.343 | 4.268 |
| 87.99739680178506 | -1.643 | 3.15 | -2.316 | 4.268 |
| 88.1647452584604 | -1.656 | 3.164 | -2.289 | 4.254 |
| 88.33209371513574 | -1.656 | 3.15 | -2.248 | 4.227 |
| 88.49944217181108 | -1.656 | 3.123 | -2.221 | 4.201 |
| 88.66679062848644 | -1.656 | 3.097 | -2.181 | 4.16 |
| 88.83413908516178 | -1.656 | 3.07 | -2.141 | 4.106 |
| 89.00148754183712 | -1.643 | 3.043 | -2.1 | 4.079 |
| 89.16883599851246 | -1.616 | 3.029 | -2.046 | 4.039 |
| 89.33618445518782 | -1.616 | 3.002 | -2.006 | 3.985 |
| 89.50353291186315 | -1.629 | 2.962 | -1.952 | 3.931 |
| 89.6708813685385 | -1.629 | 2.895 | -1.898 | 3.864 |
| 89.83822982521386 | -1.616 | 2.841 | -1.831 | 3.783 |
| 90.00557828188919 | -1.575 | 2.787 | -1.764 | 3.702 |
| 90.16362960208257 | -1.481 | 2.747 | -1.696 | 3.595 |
| 90.3309780587579 | -1.414 | 2.693 | -1.629 | 3.487 |
| 90.49832651543326 | -1.373 | 2.652 | -1.575 | 3.42 |
| 90.66567497210859 | -1.36 | 2.585 | -1.508 | 3.339 |
| 90.83302342878395 | -1.36 | 2.518 | -1.441 | 3.258 |
| 91.00037188545929 | -1.36 | 2.45 | -1.4 | 3.191 |
| 91.16772034213463 | -1.346 | 2.383 | -1.36 | 3.11 |
| 91.33506879880998 | -1.319 | 2.329 | -1.319 | 3.029 |
| 91.50241725548533 | -1.333 | 2.275 | -1.279 | 2.962 |
| 91.66976571216065 | -1.36 | 2.221 | -1.239 | 2.908 |
| 91.83711416883601 | -1.373 | 2.181 | -1.212 | 2.868 |
| 92.00446262551137 | -1.346 | 2.168 | -1.185 | 2.841 |
| 92.1718110821867 | -1.333 | 2.154 | -1.171 | 2.814 |
| 92.33915953886203 | -1.346 | 2.127 | -1.158 | 2.8 |
| 92.49721085905541 | -1.373 | 2.114 | -1.144 | 2.787 |
| 92.66455931573077 | -1.414 | 2.087 | -1.144 | 2.8 |
| 92.83190777240611 | -1.481 | 2.073 | -1.131 | 2.814 |
| 92.99925622908145 | -1.521 | 2.073 | -1.131 | 2.854 |
| 93.1666046857568 | -1.562 | 2.114 | -1.131 | 2.881 |
| 93.33395314243214 | -1.575 | 2.181 | -1.144 | 2.948 |
| 93.50130159910749 | -1.589 | 2.262 | -1.144 | 3.016 |
| 93.66865005578283 | -1.589 | 2.356 | -1.158 | 3.083 |
| 93.83599851245818 | -1.589 | 2.437 | -1.158 | 3.15 |
| 94.00334696913353 | -1.575 | 2.545 | -1.185 | 3.231 |
| 94.17069542580886 | -1.589 | 2.639 | -1.198 | 3.325 |
| 94.3380438824842 | -1.643 | 2.706 | -1.225 | 3.406 |
| 94.50539233915954 | -1.696 | 2.773 | -1.252 | 3.5 |
| 94.66344365935292 | -1.723 | 2.854 | -1.266 | 3.568 |
| 94.83079211602828 | -1.737 | 2.935 | -1.306 | 3.662 |
| 94.99814057270362 | -1.723 | 3.029 | -1.333 | 3.743 |
| 95.16548902937897 | -1.723 | 3.123 | -1.346 | 3.824 |
| 95.33283748605432 | -1.723 | 3.191 | -1.373 | 3.891 |
| 95.50018594272963 | -1.71 | 3.245 | -1.387 | 3.931 |
| 95.66753439940499 | -1.696 | 3.312 | -1.387 | 3.985 |
| 95.83488285608034 | -1.696 | 3.352 | -1.4 | 4.026 |
| 96.00223131275567 | -1.696 | 3.379 | -1.414 | 4.052 |
| 96.16957976943102 | -1.71 | 3.393 | -1.427 | 4.066 |
| 96.33692822610638 | -1.75 | 3.393 | -1.427 | 4.079 |
| 96.50427668278171 | -1.764 | 3.406 | -1.427 | 4.106 |
| 96.67162513945706 | -1.75 | 3.433 | -1.427 | 4.12 |
| 96.8389735961324 | -1.723 | 3.487 | -1.441 | 4.147 |
| 96.99702491632577 | -1.683 | 3.554 | -1.454 | 4.201 |
| 97.16437337300111 | -1.656 | 3.581 | -1.468 | 4.214 |
| 97.33172182967647 | -1.656 | 3.568 | -1.468 | 4.214 |
| 97.49907028635181 | -1.683 | 3.541 | -1.468 | 4.187 |
| 97.66641874302715 | -1.723 | 3.5 | -1.454 | 4.174 |
| 97.8337671997025 | -1.777 | 3.433 | -1.441 | 4.133 |
| 98.00111565637785 | -1.777 | 3.406 | -1.427 | 4.106 |
| 98.16846411305319 | -1.764 | 3.406 | -1.4 | 4.093 |
| 98.33581256972855 | -1.723 | 3.42 | -1.373 | 4.079 |
| 98.50316102640389 | -1.669 | 3.447 | -1.346 | 4.079 |
| 98.67050948307921 | -1.616 | 3.474 | -1.333 | 4.093 |
| 98.83785793975456 | -1.602 | 3.5 | -1.319 | 4.106 |
| 99.0052063964299 | -1.589 | 3.527 | -1.319 | 4.133 |
| 99.17255485310525 | -1.562 | 3.554 | -1.306 | 4.147 |
| 99.33060617329863 | -1.521 | 3.568 | -1.292 | 4.133 |
| 99.49795462997399 | -1.494 | 3.568 | -1.266 | 4.12 |
| 99.66530308664933 | -1.481 | 3.554 | -1.252 | 4.106 |
| 99.83265154332467 | -1.481 | 3.541 | -1.239 | 4.079 |
| 100.0 | -1.481 | 3.514 | -1.225 | 4.052 |